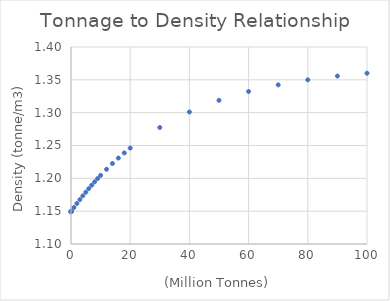
| Category | Density |
|---|---|
| 0.0 | 1.149 |
| 10.0 | 1.149 |
| 100.0 | 1.149 |
| 1000.0 | 1.149 |
| 10000.0 | 1.149 |
| 100000.0 | 1.15 |
| 1000000.0 | 1.156 |
| 2000000.0 | 1.162 |
| 3000000.0 | 1.168 |
| 4000000.0 | 1.173 |
| 5000000.0 | 1.179 |
| 6000000.0 | 1.184 |
| 7000000.0 | 1.19 |
| 8000000.0 | 1.195 |
| 9000000.0 | 1.2 |
| 10000000.0 | 1.205 |
| 12000000.0 | 1.214 |
| 14000000.0 | 1.223 |
| 16000000.0 | 1.231 |
| 18000000.0 | 1.239 |
| 20000000.0 | 1.246 |
| 30000000.0 | 1.277 |
| 40000000.0 | 1.301 |
| 50000000.0 | 1.319 |
| 60000000.0 | 1.332 |
| 70000000.0 | 1.342 |
| 80000000.0 | 1.35 |
| 90000000.0 | 1.356 |
| 100000000.0 | 1.36 |